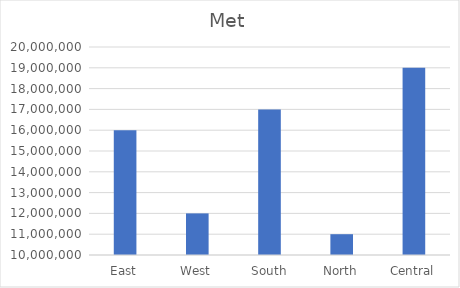
| Category | Met |
|---|---|
| East | 16000000 |
| West | 12000000 |
| South | 17000000 |
| North | 11000000 |
| Central | 19000000 |